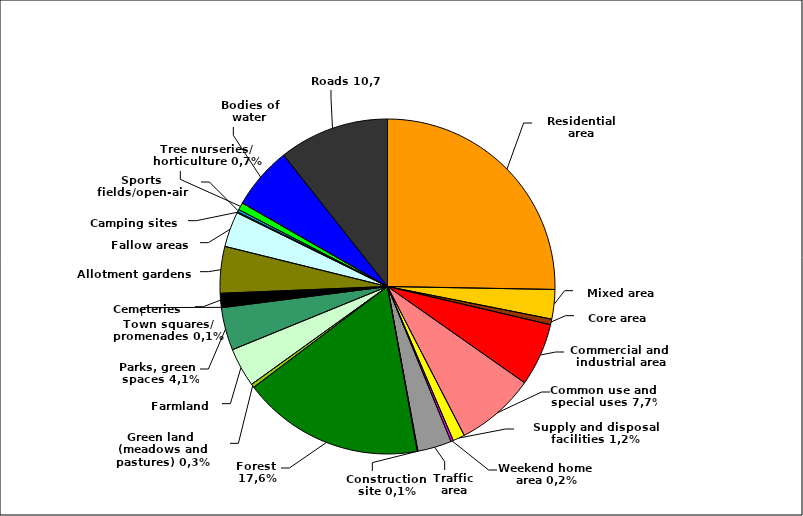
| Category | Series 0 |
|---|---|
| Residential area | 25.283 |
| Mixed area | 2.839 |
| Core area | 0.546 |
| Commercial and industrial area | 6.075 |
| Common use and special uses | 7.68 |
| Supply and disposal facilities | 1.15 |
| Weekend home area | 0.24 |
| Traffic area | 3.279 |
| Construction site | 0.057 |
| Forest | 17.575 |
| Green land (meadows and pastures) | 0.346 |
| Farmland | 3.768 |
| Parks, green spaces | 4.134 |
| Town squares/promenades | 0.083 |
| Cemeteries | 1.295 |
| Allotment gardens | 4.502 |
| Fallow areas | 3.404 |
| Camping sites | 0.101 |
| Sports fields/open-air swimming pools (incl. water sports, tennis courts, riding areas etc.) | 0.229 |
| Tree nurseries/horticulture | 0.716 |
| Bodies of water | 6.048 |
| Roads | 10.652 |